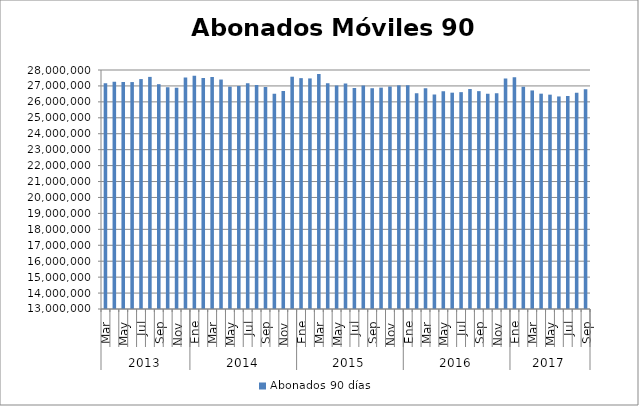
| Category | Abonados 90 días  |
|---|---|
| 0 | 27174429 |
| 1 | 27256799 |
| 2 | 27249896 |
| 3 | 27242396 |
| 4 | 27430194 |
| 5 | 27567464 |
| 6 | 27110010 |
| 7 | 26919316 |
| 8 | 26880609 |
| 9 | 27524963 |
| 10 | 27646717 |
| 11 | 27499992 |
| 12 | 27562088 |
| 13 | 27401040 |
| 14 | 26955717 |
| 15 | 26994609 |
| 16 | 27169188 |
| 17 | 27061687 |
| 18 | 26939071 |
| 19 | 26516500 |
| 20 | 26687326 |
| 21 | 27578143 |
| 22 | 27489223 |
| 23 | 27471553 |
| 24 | 27750473 |
| 25 | 27170692 |
| 26 | 27033211 |
| 27 | 27149172 |
| 28 | 26872979 |
| 29 | 27034173 |
| 30 | 26856662 |
| 31 | 26893632 |
| 32 | 26963755 |
| 33 | 27037951 |
| 34 | 27040824 |
| 35 | 26542149 |
| 36 | 26849710 |
| 37 | 26457447 |
| 38 | 26662676 |
| 39 | 26576782 |
| 40 | 26610099 |
| 41 | 26805521 |
| 42 | 26672717 |
| 43 | 26505805 |
| 44 | 26547173 |
| 45 | 27469211 |
| 46 | 27539556 |
| 47 | 26948853 |
| 48 | 26717067 |
| 49 | 26514588 |
| 50 | 26452370 |
| 51 | 26339907 |
| 52 | 26362130 |
| 53 | 26570054 |
| 54 | 26786764 |